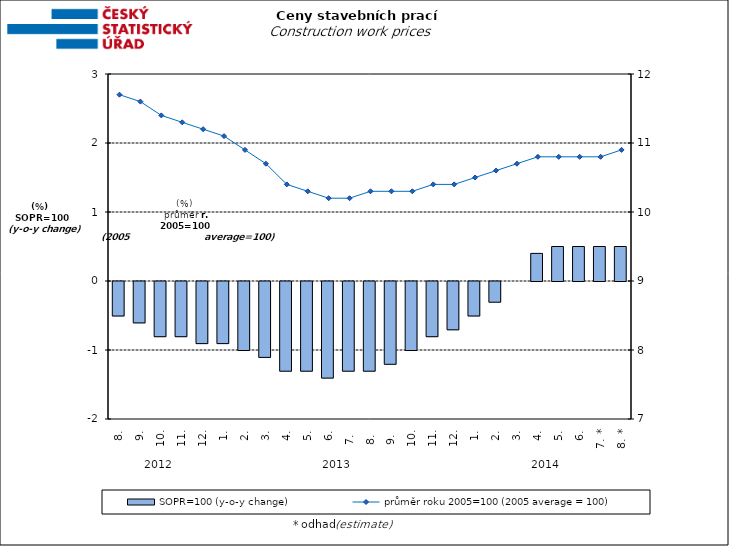
| Category | SOPR=100 (y-o-y change)   |
|---|---|
| 0 | -0.5 |
| 1 | -0.6 |
| 2 | -0.8 |
| 3 | -0.8 |
| 4 | -0.9 |
| 5 | -0.9 |
| 6 | -1 |
| 7 | -1.1 |
| 8 | -1.3 |
| 9 | -1.3 |
| 10 | -1.4 |
| 11 | -1.3 |
| 12 | -1.3 |
| 13 | -1.2 |
| 14 | -1 |
| 15 | -0.8 |
| 16 | -0.7 |
| 17 | -0.5 |
| 18 | -0.3 |
| 19 | 0 |
| 20 | 0.4 |
| 21 | 0.5 |
| 22 | 0.5 |
| 23 | 0.5 |
| 24 | 0.5 |